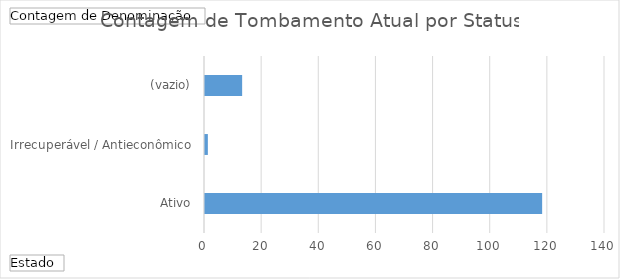
| Category | Total |
|---|---|
| Ativo | 118 |
| Irrecuperável / Antieconômico | 1 |
| (vazio) | 13 |